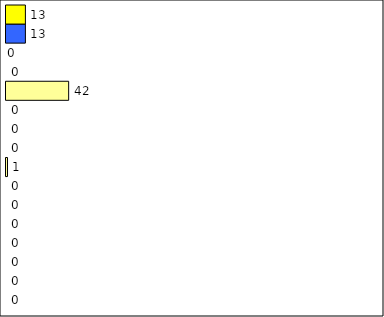
| Category | -2 | -1 | 0 | 1 | 2 | 3 | 4 | 5 | 6 | 7 | 8 | 9 | 10 | 11 | 12 | Perfect Round |
|---|---|---|---|---|---|---|---|---|---|---|---|---|---|---|---|---|
| 0 | 0 | 0 | 0 | 0 | 0 | 0 | 0 | 1 | 0 | 0 | 0 | 42 | 0 | 0 | 13 | 13 |